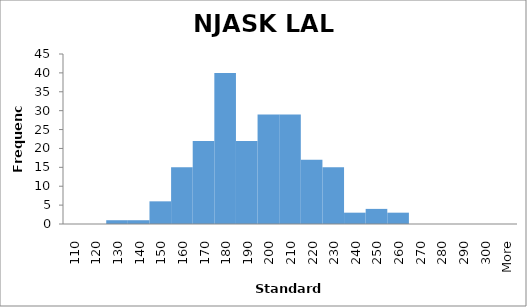
| Category | Frequency |
|---|---|
| 110 | 0 |
| 120 | 0 |
| 130 | 1 |
| 140 | 1 |
| 150 | 6 |
| 160 | 15 |
| 170 | 22 |
| 180 | 40 |
| 190 | 22 |
| 200 | 29 |
| 210 | 29 |
| 220 | 17 |
| 230 | 15 |
| 240 | 3 |
| 250 | 4 |
| 260 | 3 |
| 270 | 0 |
| 280 | 0 |
| 290 | 0 |
| 300 | 0 |
| More | 0 |